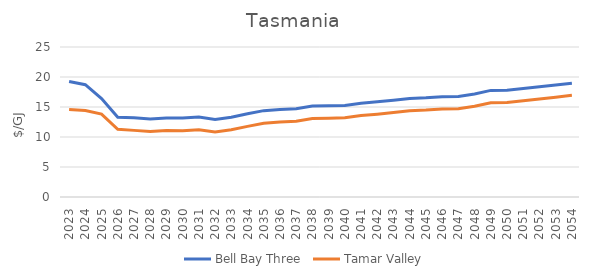
| Category | Bell Bay Three | Tamar Valley |
|---|---|---|
| 2023.0 | 19.254 | 14.595 |
| 2024.0 | 18.718 | 14.406 |
| 2025.0 | 16.404 | 13.807 |
| 2026.0 | 13.295 | 11.295 |
| 2027.0 | 13.204 | 11.104 |
| 2028.0 | 13 | 10.9 |
| 2029.0 | 13.165 | 11.065 |
| 2030.0 | 13.146 | 11.046 |
| 2031.0 | 13.313 | 11.213 |
| 2032.0 | 12.93 | 10.83 |
| 2033.0 | 13.294 | 11.194 |
| 2034.0 | 13.871 | 11.771 |
| 2035.0 | 14.394 | 12.294 |
| 2036.0 | 14.583 | 12.483 |
| 2037.0 | 14.712 | 12.612 |
| 2038.0 | 15.166 | 13.066 |
| 2039.0 | 15.208 | 13.108 |
| 2040.0 | 15.252 | 13.202 |
| 2041.0 | 15.638 | 13.588 |
| 2042.0 | 15.857 | 13.807 |
| 2043.0 | 16.115 | 14.065 |
| 2044.0 | 16.42 | 14.37 |
| 2045.0 | 16.532 | 14.482 |
| 2046.0 | 16.711 | 14.661 |
| 2047.0 | 16.742 | 14.692 |
| 2048.0 | 17.161 | 15.111 |
| 2049.0 | 17.769 | 15.719 |
| 2050.0 | 17.788 | 15.769 |
| 2051.0 | 18.071 | 16.055 |
| 2052.0 | 18.358 | 16.346 |
| 2053.0 | 18.651 | 16.642 |
| 2054.0 | 18.948 | 16.943 |